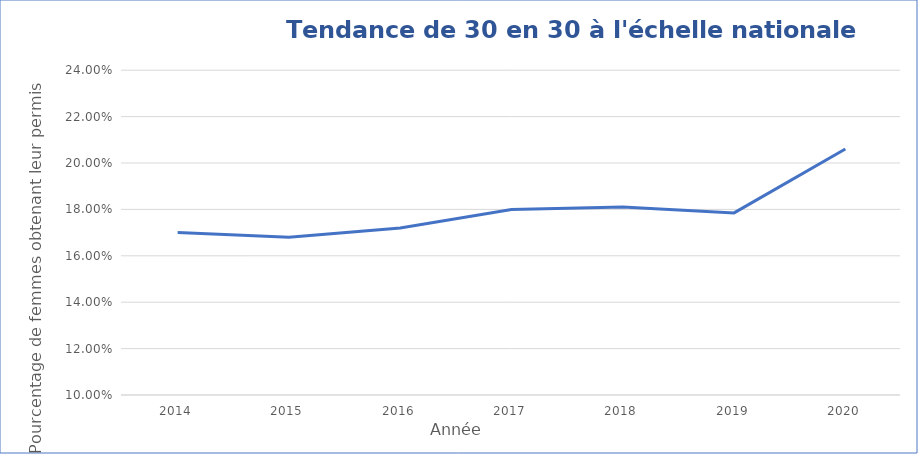
| Category |  Pourcentage de 30 en 30 à l'échelle nationale  |
|---|---|
| 2014.0 | 0.17 |
| 2015.0 | 0.168 |
| 2016.0 | 0.172 |
| 2017.0 | 0.18 |
| 2018.0 | 0.181 |
| 2019.0 | 0.178 |
| 2020.0 | 0.206 |